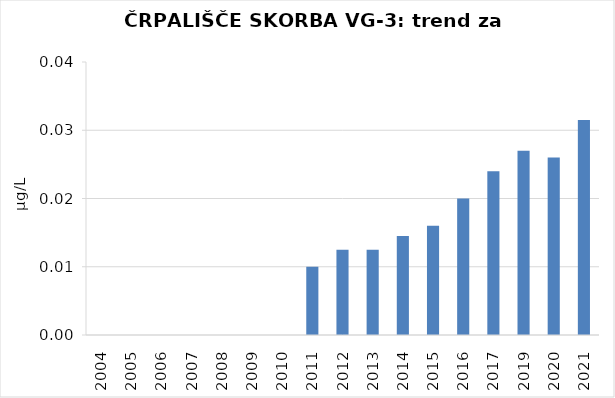
| Category | Vsota |
|---|---|
| 2004 | 0 |
| 2005 | 0 |
| 2006 | 0 |
| 2007 | 0 |
| 2008 | 0 |
| 2009 | 0 |
| 2010 | 0 |
| 2011 | 0.01 |
| 2012 | 0.012 |
| 2013 | 0.012 |
| 2014 | 0.014 |
| 2015 | 0.016 |
| 2016 | 0.02 |
| 2017 | 0.024 |
| 2019 | 0.027 |
| 2020 | 0.026 |
| 2021 | 0.032 |